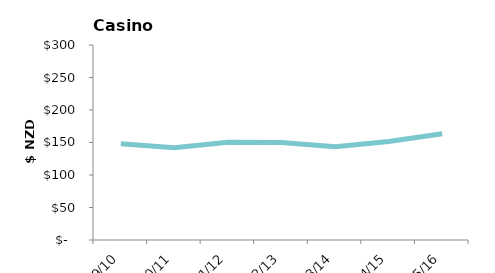
| Category | Inflation adjusted expenditure per capita |
|---|---|
| 2009/10 | 148.168 |
| 2010/11 | 142.094 |
| 2011/12 | 150.371 |
| 2012/13 | 149.884 |
| 2013/14 | 143.474 |
| 2014/15 | 151.462 |
| 2015/16 | 163.39 |